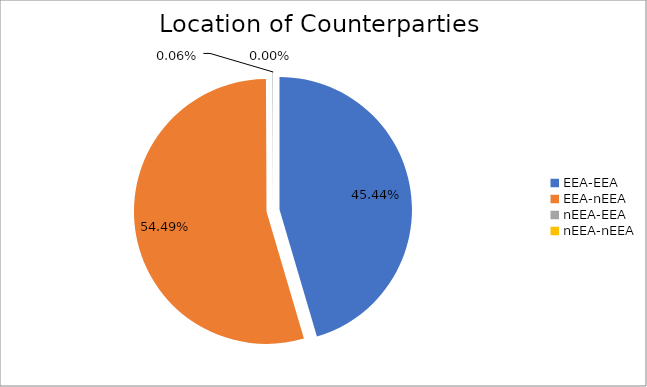
| Category | Series 0 |
|---|---|
| EEA-EEA | 6087589.993 |
| EEA-nEEA | 7300388.006 |
| nEEA-EEA | 8566.034 |
| nEEA-nEEA | 103.543 |